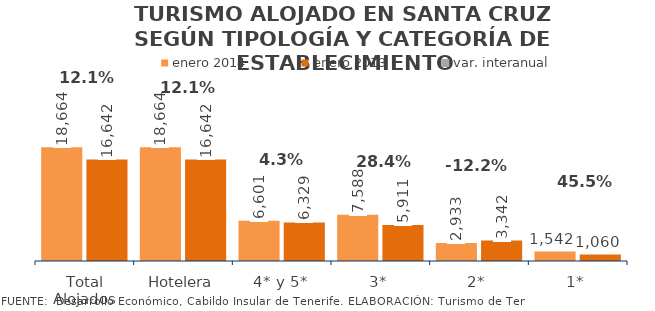
| Category | enero 2014 | enero 2013 |
|---|---|---|
| Total Alojados | 18664 | 16642 |
| Hotelera | 18664 | 16642 |
| 4* y 5* | 6601 | 6329 |
| 3* | 7588 | 5911 |
| 2* | 2933 | 3342 |
| 1* | 1542 | 1060 |